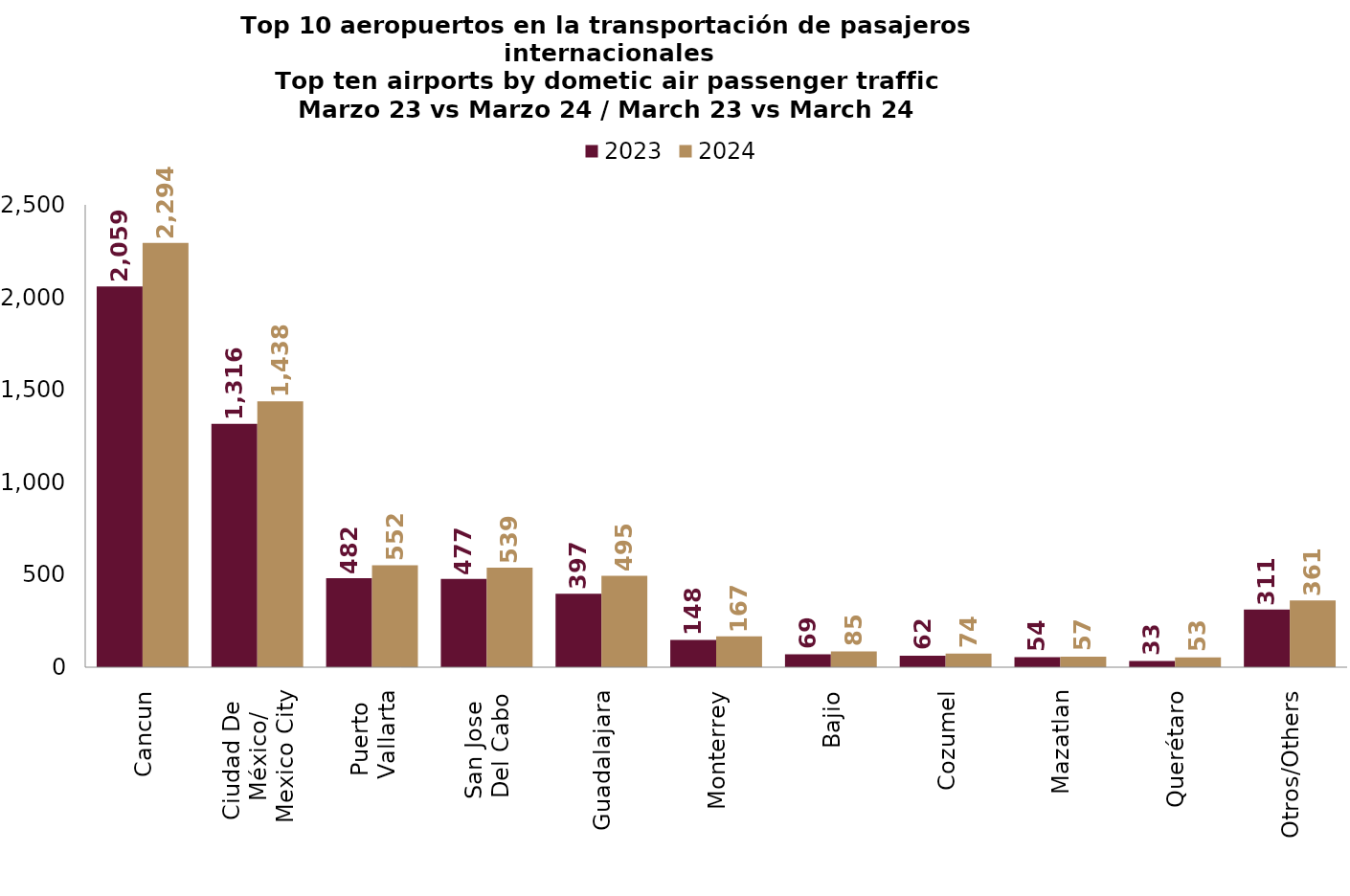
| Category | 2023 | 2024 |
|---|---|---|
| Cancun | 2058.778 | 2293.646 |
| Ciudad De 
México/
Mexico City | 1315.597 | 1437.728 |
| Puerto 
Vallarta | 481.66 | 551.651 |
| San Jose 
Del Cabo | 476.91 | 538.642 |
| Guadalajara | 397.363 | 494.776 |
| Monterrey | 147.625 | 167.258 |
| Bajio | 69.495 | 84.787 |
| Cozumel | 61.629 | 73.65 |
| Mazatlan | 53.867 | 56.69 |
| Querétaro | 33.399 | 53.387 |
| Otros/Others | 311.301 | 361.3 |